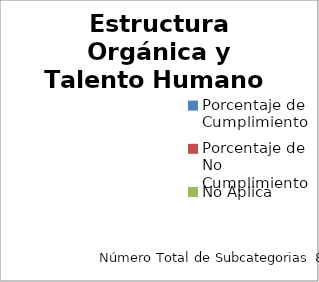
| Category | Estructura Orgánica y Talento Humano |
|---|---|
| Porcentaje de Cumplimiento | 0 |
| Porcentaje de No Cumplimiento | 0 |
| No Aplica | 0 |